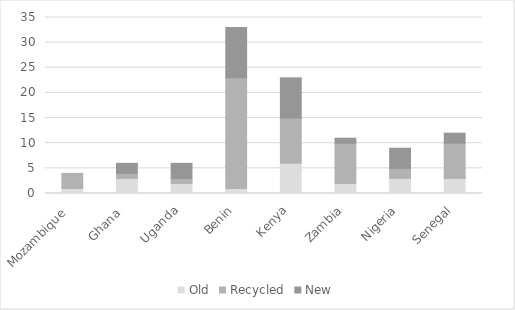
| Category | Old | Recycled | New |
|---|---|---|---|
| Mozambique  | 1 | 3 | 0 |
| Ghana  | 3 | 1 | 2 |
| Uganda | 2 | 1 | 3 |
| Benin | 1 | 22 | 10 |
| Kenya | 6 | 9 | 8 |
| Zambia | 2 | 8 | 1 |
| Nigeria | 3 | 2 | 4 |
| Senegal | 3 | 7 | 2 |